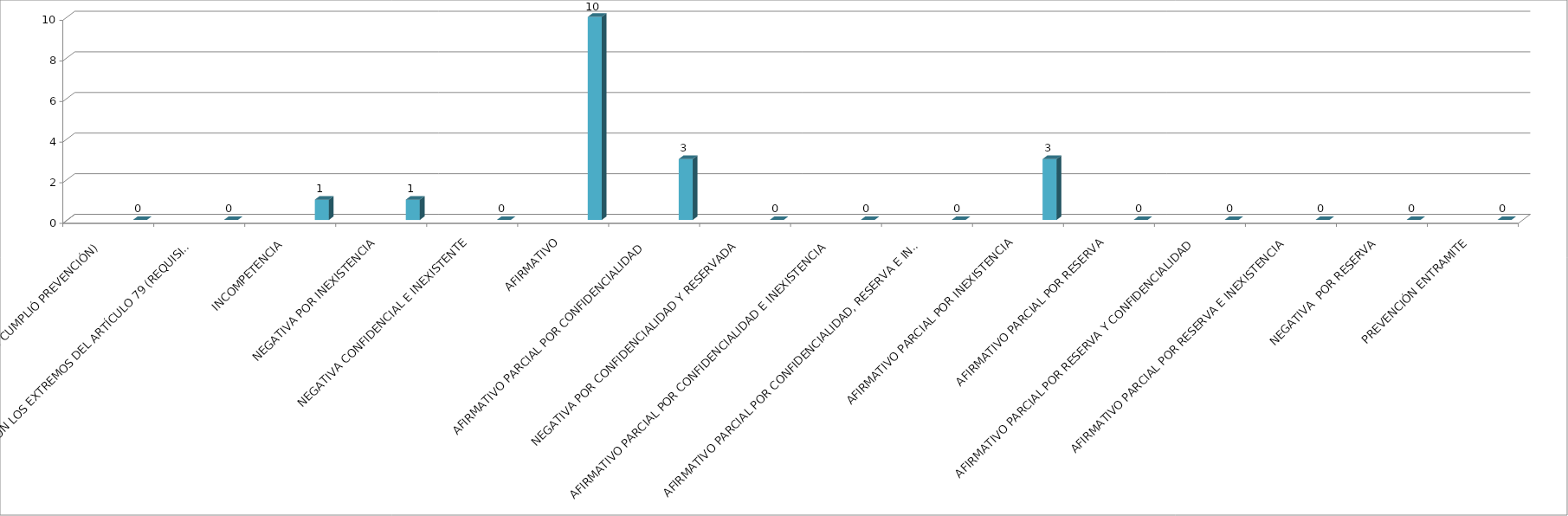
| Category | Series 0 | Series 1 | Series 2 | Series 3 | Series 4 |
|---|---|---|---|---|---|
| SE TIENE POR NO PRESENTADA ( NO CUMPLIÓ PREVENCIÓN) |  |  |  |  | 0 |
| NO CUMPLIO CON LOS EXTREMOS DEL ARTÍCULO 79 (REQUISITOS) |  |  |  |  | 0 |
| INCOMPETENCIA  |  |  |  |  | 1 |
| NEGATIVA POR INEXISTENCIA |  |  |  |  | 1 |
| NEGATIVA CONFIDENCIAL E INEXISTENTE |  |  |  |  | 0 |
| AFIRMATIVO |  |  |  |  | 10 |
| AFIRMATIVO PARCIAL POR CONFIDENCIALIDAD  |  |  |  |  | 3 |
| NEGATIVA POR CONFIDENCIALIDAD Y RESERVADA |  |  |  |  | 0 |
| AFIRMATIVO PARCIAL POR CONFIDENCIALIDAD E INEXISTENCIA |  |  |  |  | 0 |
| AFIRMATIVO PARCIAL POR CONFIDENCIALIDAD, RESERVA E INEXISTENCIA |  |  |  |  | 0 |
| AFIRMATIVO PARCIAL POR INEXISTENCIA |  |  |  |  | 3 |
| AFIRMATIVO PARCIAL POR RESERVA |  |  |  |  | 0 |
| AFIRMATIVO PARCIAL POR RESERVA Y CONFIDENCIALIDAD |  |  |  |  | 0 |
| AFIRMATIVO PARCIAL POR RESERVA E INEXISTENCIA |  |  |  |  | 0 |
| NEGATIVA  POR RESERVA |  |  |  |  | 0 |
| PREVENCIÓN ENTRAMITE |  |  |  |  | 0 |